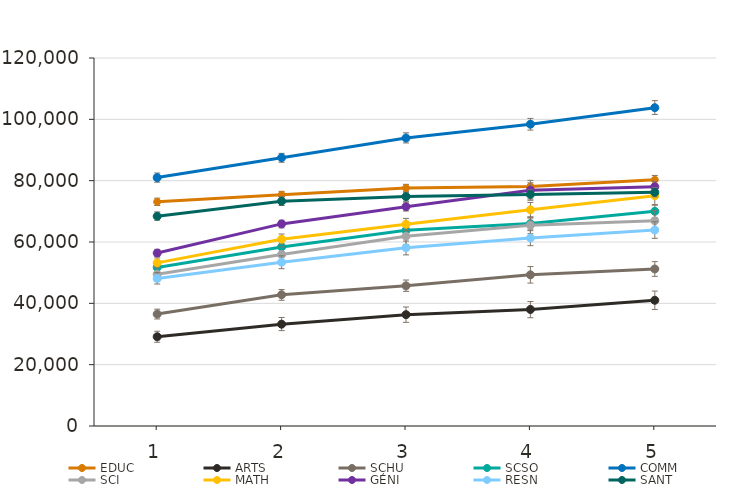
| Category | EDUC | ARTS | SCHU | SCSO | COMM | SCI | MATH | GÉNI | RESN | SANT |
|---|---|---|---|---|---|---|---|---|---|---|
| 1.0 | 73100 | 29100 | 36500 | 51700 | 81000 | 49500 | 53200 | 56400 | 48100 | 68400 |
| 2.0 | 75400 | 33200 | 42800 | 58400 | 87500 | 55900 | 60900 | 65900 | 53400 | 73300 |
| 3.0 | 77600 | 36300 | 45700 | 63800 | 93900 | 61900 | 65800 | 71500 | 58100 | 74800 |
| 4.0 | 78100 | 38000 | 49300 | 66000 | 98400 | 65500 | 70500 | 76900 | 61300 | 75500 |
| 5.0 | 80300 | 41000 | 51200 | 70000 | 103800 | 66900 | 75100 | 78000 | 63900 | 76200 |